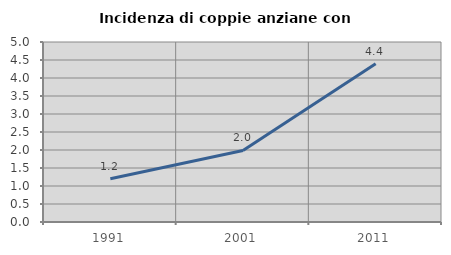
| Category | Incidenza di coppie anziane con figli |
|---|---|
| 1991.0 | 1.2 |
| 2001.0 | 1.987 |
| 2011.0 | 4.393 |